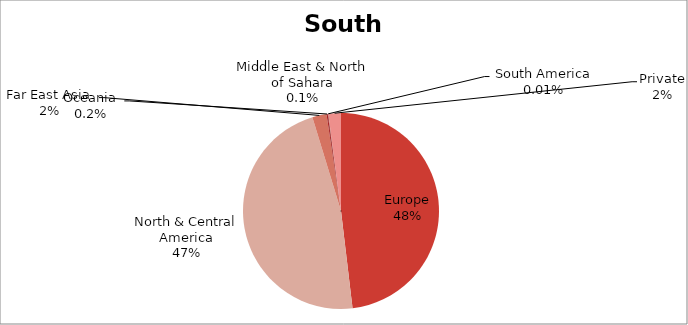
| Category | US$ millions |
|---|---|
| Europe | 606.264 |
| North & Central America | 594.259 |
| Far East Asia | 29.587 |
| Oceania | 2.543 |
| Middle East & North of Sahara | 1.011 |
| South America | 0.1 |
| Private | 26.191 |